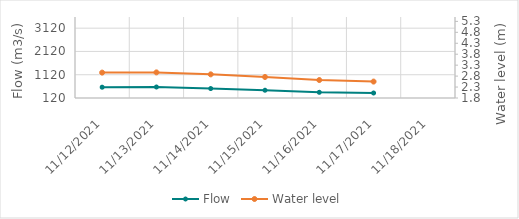
| Category | Flow |
|---|---|
| 7/29/21 | 854.88 |
| 7/28/21 | 754.37 |
| 7/27/21 | 775.59 |
| 7/26/21 | 766.9 |
| 7/25/21 | 731.6 |
| 7/24/21 | 744.71 |
| 7/23/21 | 715.87 |